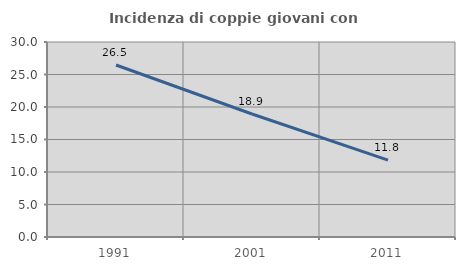
| Category | Incidenza di coppie giovani con figli |
|---|---|
| 1991.0 | 26.463 |
| 2001.0 | 18.925 |
| 2011.0 | 11.831 |